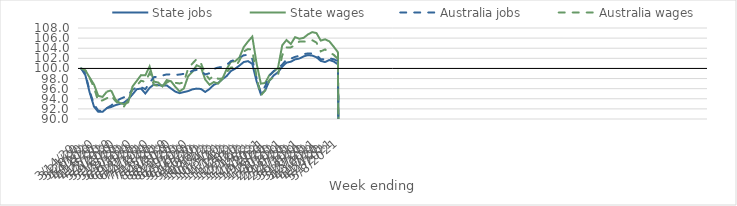
| Category | State jobs | State wages | Australia jobs | Australia wages |
|---|---|---|---|---|
| 14/03/2020 | 100 | 100 | 100 | 100 |
| 21/03/2020 | 98.645 | 99.61 | 98.971 | 99.603 |
| 28/03/2020 | 95.231 | 98.176 | 95.467 | 98.105 |
| 04/04/2020 | 92.458 | 96.829 | 92.92 | 96.234 |
| 11/04/2020 | 91.412 | 94.58 | 91.647 | 93.487 |
| 18/04/2020 | 91.416 | 94.367 | 91.63 | 93.692 |
| 25/04/2020 | 92.141 | 95.406 | 92.16 | 94.108 |
| 02/05/2020 | 92.362 | 95.669 | 92.657 | 94.655 |
| 09/05/2020 | 92.731 | 93.876 | 93.343 | 93.578 |
| 16/05/2020 | 92.972 | 93.185 | 93.935 | 92.812 |
| 23/05/2020 | 93.228 | 92.93 | 94.291 | 92.462 |
| 30/05/2020 | 93.895 | 93.294 | 94.798 | 93.79 |
| 06/06/2020 | 94.862 | 96.432 | 95.781 | 95.926 |
| 13/06/2020 | 95.892 | 97.542 | 96.28 | 96.602 |
| 20/06/2020 | 96.025 | 98.679 | 96.296 | 97.58 |
| 27/06/2020 | 95.04 | 98.642 | 95.902 | 97.326 |
| 04/07/2020 | 96.154 | 100.391 | 97.157 | 99.113 |
| 11/07/2020 | 96.827 | 97.4 | 98.279 | 96.733 |
| 18/07/2020 | 96.695 | 97.211 | 98.382 | 96.561 |
| 25/07/2020 | 96.602 | 96.433 | 98.604 | 96.362 |
| 01/08/2020 | 96.65 | 97.695 | 98.826 | 97.197 |
| 08/08/2020 | 96.034 | 97.473 | 98.822 | 97.652 |
| 15/08/2020 | 95.42 | 96.382 | 98.73 | 97.16 |
| 22/08/2020 | 95.114 | 95.469 | 98.792 | 97.027 |
| 29/08/2020 | 95.325 | 96.026 | 98.928 | 97.246 |
| 05/09/2020 | 95.521 | 98.457 | 99.113 | 99.964 |
| 12/09/2020 | 95.865 | 99.314 | 99.531 | 100.967 |
| 19/09/2020 | 96.011 | 100.634 | 99.714 | 101.852 |
| 26/09/2020 | 95.937 | 100.246 | 99.52 | 101.02 |
| 03/10/2020 | 95.352 | 97.803 | 98.806 | 98.883 |
| 10/10/2020 | 95.93 | 96.77 | 99.055 | 97.873 |
| 17/10/2020 | 96.758 | 97.314 | 99.899 | 98.568 |
| 24/10/2020 | 97.121 | 97.006 | 100.18 | 97.964 |
| 31/10/2020 | 97.873 | 97.915 | 100.306 | 97.998 |
| 07/11/2020 | 98.493 | 99.854 | 100.68 | 99.252 |
| 14/11/2020 | 99.487 | 101.329 | 101.424 | 100.173 |
| 21/11/2020 | 99.954 | 101.417 | 101.745 | 100.229 |
| 28/11/2020 | 100.578 | 102.189 | 102.059 | 101.576 |
| 05/12/2020 | 101.268 | 104.228 | 102.608 | 103.362 |
| 12/12/2020 | 101.444 | 105.326 | 102.679 | 103.837 |
| 19/12/2020 | 100.903 | 106.295 | 101.871 | 103.708 |
| 26/12/2020 | 97.47 | 101.003 | 98.073 | 98.239 |
| 02/01/2021 | 94.903 | 96.994 | 95.142 | 94.651 |
| 09/01/2021 | 95.651 | 97.132 | 96.464 | 95.644 |
| 16/01/2021 | 97.57 | 98.687 | 98.546 | 97.678 |
| 23/01/2021 | 98.615 | 99.376 | 99.493 | 98.293 |
| 30/01/2021 | 99.237 | 100.079 | 99.995 | 98.662 |
| 06/02/2021 | 100.358 | 104.589 | 100.749 | 102.61 |
| 13/02/2021 | 101.15 | 105.626 | 101.78 | 104.166 |
| 20/02/2021 | 101.326 | 104.823 | 101.937 | 104.163 |
| 27/02/2021 | 101.794 | 106.189 | 102.282 | 104.593 |
| 06/03/2021 | 101.965 | 105.868 | 102.496 | 105.335 |
| 13/03/2021 | 102.379 | 106.046 | 102.825 | 105.317 |
| 20/03/2021 | 102.638 | 106.724 | 102.964 | 105.281 |
| 27/03/2021 | 102.545 | 107.185 | 102.951 | 105.588 |
| 03/04/2021 | 102.211 | 106.996 | 102.614 | 105.117 |
| 10/04/2021 | 101.496 | 105.507 | 101.84 | 103.377 |
| 17/04/2021 | 101.266 | 105.761 | 101.797 | 103.762 |
| 24/04/2021 | 101.668 | 105.365 | 102 | 103.175 |
| 01/05/2021 | 101.382 | 104.332 | 101.825 | 102.713 |
| 08/05/2021 | 100.822 | 103.22 | 101.453 | 101.885 |